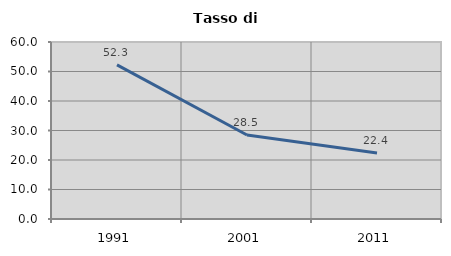
| Category | Tasso di disoccupazione   |
|---|---|
| 1991.0 | 52.251 |
| 2001.0 | 28.464 |
| 2011.0 | 22.403 |